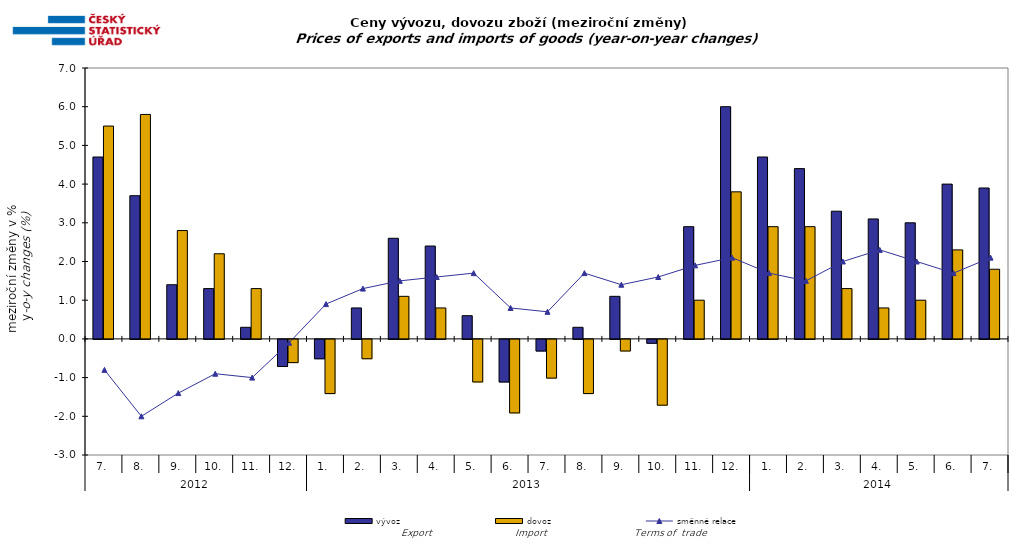
| Category | vývoz | dovoz |
|---|---|---|
| 0 | 4.7 | 5.5 |
| 1 | 3.7 | 5.8 |
| 2 | 1.4 | 2.8 |
| 3 | 1.3 | 2.2 |
| 4 | 0.3 | 1.3 |
| 5 | -0.7 | -0.6 |
| 6 | -0.5 | -1.4 |
| 7 | 0.8 | -0.5 |
| 8 | 2.6 | 1.1 |
| 9 | 2.4 | 0.8 |
| 10 | 0.6 | -1.1 |
| 11 | -1.1 | -1.9 |
| 12 | -0.3 | -1 |
| 13 | 0.3 | -1.4 |
| 14 | 1.1 | -0.3 |
| 15 | -0.1 | -1.7 |
| 16 | 2.9 | 1 |
| 17 | 6 | 3.8 |
| 18 | 4.7 | 2.9 |
| 19 | 4.4 | 2.9 |
| 20 | 3.3 | 1.3 |
| 21 | 3.1 | 0.8 |
| 22 | 3 | 1 |
| 23 | 4 | 2.3 |
| 24 | 3.9 | 1.8 |